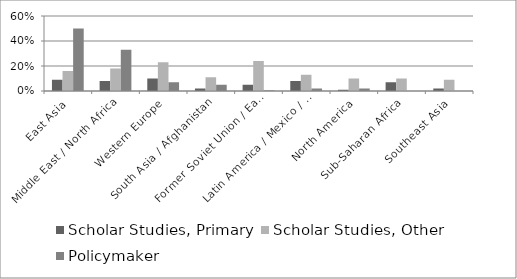
| Category | Scholar Studies, Primary | Scholar Studies, Other | Policymaker |
|---|---|---|---|
| East Asia | 0.09 | 0.16 | 0.5 |
| Middle East / North Africa | 0.08 | 0.18 | 0.33 |
| Western Europe | 0.1 | 0.23 | 0.07 |
| South Asia / Afghanistan | 0.02 | 0.11 | 0.05 |
| Former Soviet Union / Eastern Europe | 0.05 | 0.24 | 0.005 |
| Latin America / Mexico / Caribbean | 0.08 | 0.13 | 0.02 |
| North America | 0.01 | 0.1 | 0.02 |
| Sub-Saharan Africa | 0.07 | 0.1 | 0 |
| Southeast Asia | 0.02 | 0.09 | 0 |